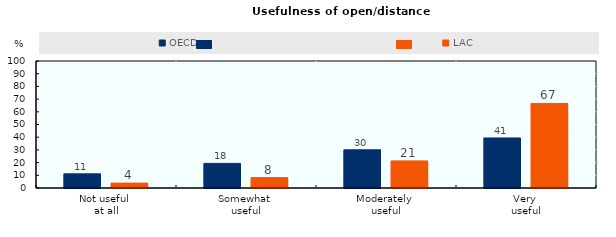
| Category | OECD | LAC |
|---|---|---|
| Not useful 
at all | 11.136 | 3.865 |
| Somewhat 
useful | 19.383 | 8.19 |
| Moderately 
useful | 30.077 | 21.339 |
| Very 
useful | 39.403 | 66.605 |